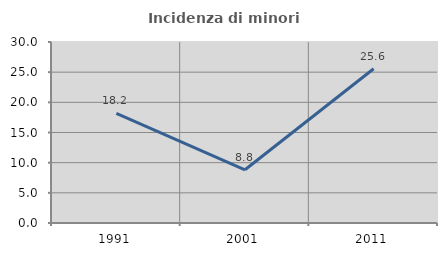
| Category | Incidenza di minori stranieri |
|---|---|
| 1991.0 | 18.182 |
| 2001.0 | 8.824 |
| 2011.0 | 25.564 |